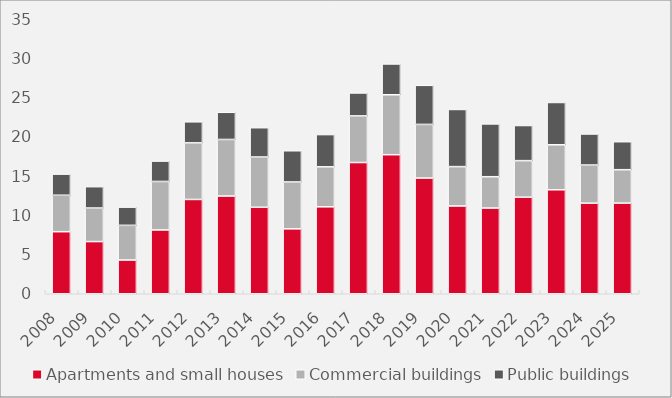
| Category | Apartments and small houses | Commercial buildings | Public buildings |
|---|---|---|---|
| 2008.0 | 7.899 | 4.638 | 2.691 |
| 2009.0 | 6.642 | 4.268 | 2.719 |
| 2010.0 | 4.292 | 4.416 | 2.318 |
| 2011.0 | 8.125 | 6.167 | 2.594 |
| 2012.0 | 12.002 | 7.201 | 2.684 |
| 2013.0 | 12.437 | 7.2 | 3.458 |
| 2014.0 | 11.006 | 6.399 | 3.729 |
| 2015.0 | 8.263 | 5.965 | 3.974 |
| 2016.0 | 11.066 | 5.089 | 4.104 |
| 2017.0 | 16.701 | 5.932 | 2.923 |
| 2018.0 | 17.698 | 7.629 | 3.921 |
| 2019.0 | 14.727 | 6.825 | 4.975 |
| 2020.0 | 11.172 | 5.009 | 7.274 |
| 2021.0 | 10.906 | 3.991 | 6.723 |
| 2022.0 | 12.29 | 4.652 | 4.471 |
| 2023.0 | 13.236 | 5.723 | 5.385 |
| 2024.0 | 11.53 | 4.853 | 3.953 |
| 2025.0 | 11.538 | 4.251 | 3.563 |